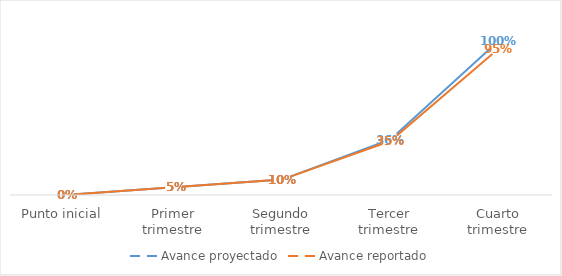
| Category | Avance proyectado | Avance reportado |
|---|---|---|
| Punto inicial | 0 | 0 |
| Primer trimestre | 0.05 | 0.05 |
| Segundo trimestre | 0.1 | 0.1 |
| Tercer trimestre | 0.36 | 0.35 |
| Cuarto trimestre | 1 | 0.95 |